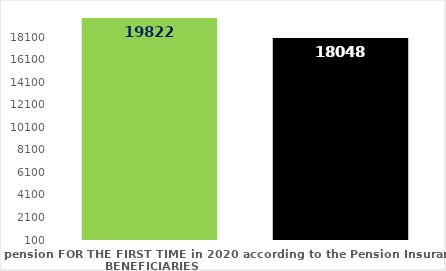
| Category | broj korisnika |
|---|---|
| Pension beneficiaries entitled to pension FOR THE FIRST TIME in 2020 according to the Pension Insurance Act  - NEW BENEFICIARIES | 19822 |
| Pension beneficiaries whose pension entitlement ceased in 2020  -  death caused,   
and who were retired according to the Pension Insurance Act   | 18048 |